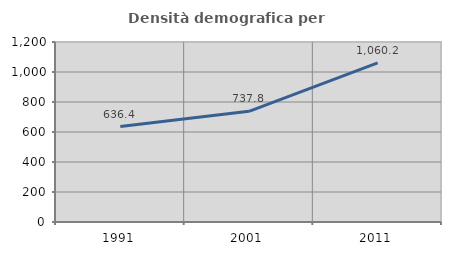
| Category | Densità demografica |
|---|---|
| 1991.0 | 636.447 |
| 2001.0 | 737.8 |
| 2011.0 | 1060.213 |